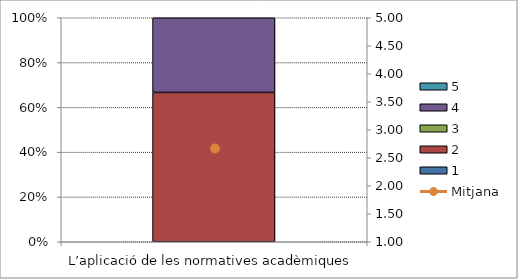
| Category | 1 | 2 | 3 | 4 | 5 |
|---|---|---|---|---|---|
| L’aplicació de les normatives acadèmiques | 0 | 2 | 0 | 1 | 0 |